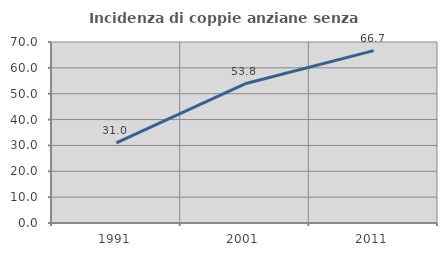
| Category | Incidenza di coppie anziane senza figli  |
|---|---|
| 1991.0 | 30.952 |
| 2001.0 | 53.846 |
| 2011.0 | 66.667 |